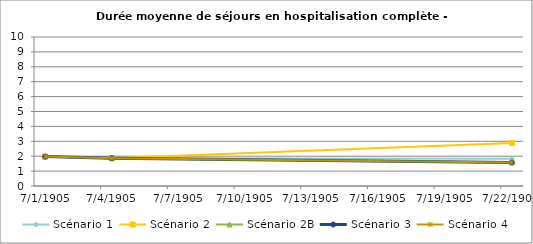
| Category | Scénario 1 | Scénario 2 | Scénario 2B | Scénario 3 | Scénario 4 |
|---|---|---|---|---|---|
| 2009.0 | 1.975 | 1.975 | 1.975 | 1.975 | 1.975 |
| 2012.0 | 1.871 | 1.871 | 1.871 | 1.871 | 1.871 |
| 2030.0 | 1.829 | 2.891 | 1.579 | 1.579 | 1.576 |